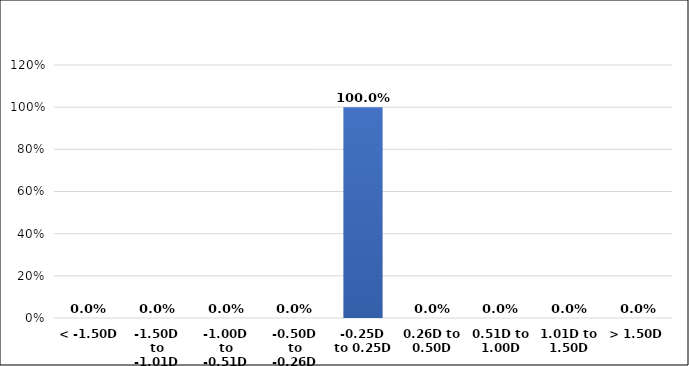
| Category | Series 0 |
|---|---|
| < -1.50D | 0 |
| -1.50D to -1.01D | 0 |
| -1.00D to -0.51D | 0 |
| -0.50D to -0.26D | 0 |
| -0.25D to 0.25D | 1 |
| 0.26D to 0.50D | 0 |
| 0.51D to 1.00D | 0 |
| 1.01D to 1.50D | 0 |
| > 1.50D | 0 |